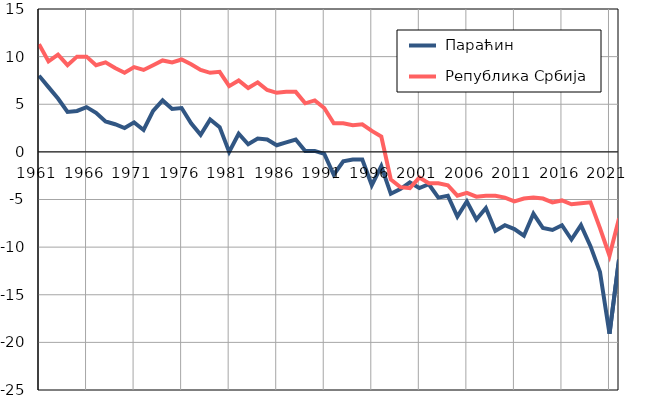
| Category |  Параћин |  Република Србија |
|---|---|---|
| 1961.0 | 8 | 11.3 |
| 1962.0 | 6.8 | 9.5 |
| 1963.0 | 5.6 | 10.2 |
| 1964.0 | 4.2 | 9.1 |
| 1965.0 | 4.3 | 10 |
| 1966.0 | 4.7 | 10 |
| 1967.0 | 4.1 | 9.1 |
| 1968.0 | 3.2 | 9.4 |
| 1969.0 | 2.9 | 8.8 |
| 1970.0 | 2.5 | 8.3 |
| 1971.0 | 3.1 | 8.9 |
| 1972.0 | 2.3 | 8.6 |
| 1973.0 | 4.3 | 9.1 |
| 1974.0 | 5.4 | 9.6 |
| 1975.0 | 4.5 | 9.4 |
| 1976.0 | 4.6 | 9.7 |
| 1977.0 | 3 | 9.2 |
| 1978.0 | 1.8 | 8.6 |
| 1979.0 | 3.4 | 8.3 |
| 1980.0 | 2.6 | 8.4 |
| 1981.0 | 0 | 6.9 |
| 1982.0 | 1.9 | 7.5 |
| 1983.0 | 0.8 | 6.7 |
| 1984.0 | 1.4 | 7.3 |
| 1985.0 | 1.3 | 6.5 |
| 1986.0 | 0.7 | 6.2 |
| 1987.0 | 1 | 6.3 |
| 1988.0 | 1.3 | 6.3 |
| 1989.0 | 0.1 | 5.1 |
| 1990.0 | 0.1 | 5.4 |
| 1991.0 | -0.2 | 4.6 |
| 1992.0 | -2.4 | 3 |
| 1993.0 | -1 | 3 |
| 1994.0 | -0.8 | 2.8 |
| 1995.0 | -0.8 | 2.9 |
| 1996.0 | -3.5 | 2.2 |
| 1997.0 | -1.5 | 1.6 |
| 1998.0 | -4.4 | -2.9 |
| 1999.0 | -3.9 | -3.7 |
| 2000.0 | -3.2 | -3.8 |
| 2001.0 | -3.8 | -2.7 |
| 2002.0 | -3.4 | -3.3 |
| 2003.0 | -4.8 | -3.3 |
| 2004.0 | -4.6 | -3.5 |
| 2005.0 | -6.8 | -4.6 |
| 2006.0 | -5.2 | -4.3 |
| 2007.0 | -7.1 | -4.7 |
| 2008.0 | -5.9 | -4.6 |
| 2009.0 | -8.3 | -4.6 |
| 2010.0 | -7.7 | -4.8 |
| 2011.0 | -8.1 | -5.2 |
| 2012.0 | -8.8 | -4.9 |
| 2013.0 | -6.5 | -4.8 |
| 2014.0 | -8 | -4.9 |
| 2015.0 | -8.2 | -5.3 |
| 2016.0 | -7.7 | -5.1 |
| 2017.0 | -9.2 | -5.5 |
| 2018.0 | -7.7 | -5.4 |
| 2019.0 | -9.9 | -5.3 |
| 2020.0 | -12.6 | -8 |
| 2021.0 | -19.1 | -10.9 |
| 2022.0 | -11.3 | -7 |